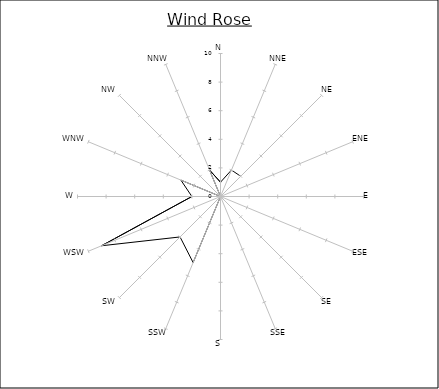
| Category | Series 0 |
|---|---|
| N | 1 |
| NNE | 2 |
| NE | 2 |
| ENE | 0 |
| E | 0 |
| ESE | 0 |
| SE | 0 |
| SSE | 0 |
| S | 0 |
| SSW | 5 |
| SW | 4 |
| WSW | 9 |
| W | 2 |
| WNW | 3 |
| NW | 0 |
| NNW | 2 |